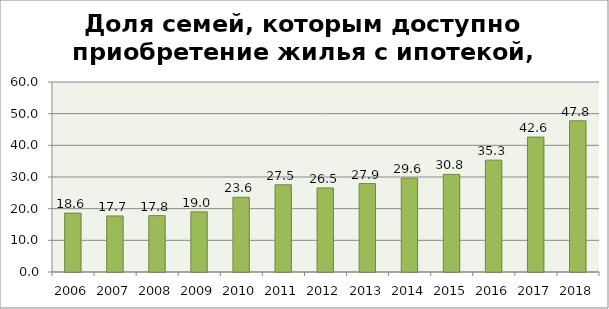
| Category | Series 0 |
|---|---|
| 2006 | 18.6 |
| 2007 | 17.7 |
| 2008 | 17.8 |
| 2009 | 19 |
| 2010 | 23.6 |
| 2011 | 27.543 |
| 2012 | 26.55 |
| 2013 | 27.916 |
| 2014 | 29.608 |
| 2015 | 30.813 |
| 2016 | 35.327 |
| 2017 | 42.604 |
| 2018 | 47.752 |